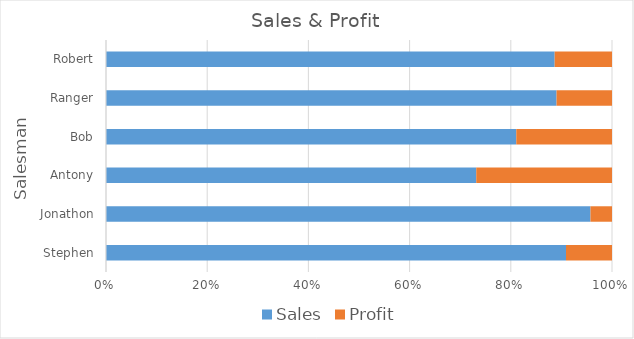
| Category | Sales | Profit |
|---|---|---|
| Stephen | 100 | 10 |
| Jonathon | 900 | 40 |
| Antony | 300 | 110 |
| Bob | 150 | 35 |
| Ranger | 650 | 80 |
| Robert | 180 | 23 |